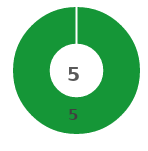
| Category | Series 0 |
|---|---|
| 0 | 5 |
| 1 | 0 |
| 2 | 0 |
| 3 | 0 |
| 4 | 0 |